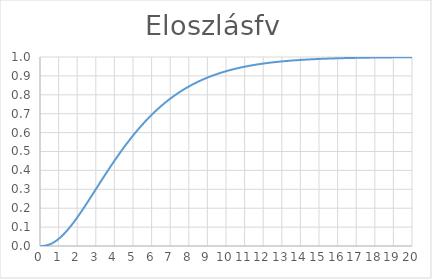
| Category | Series 0 |
|---|---|
| 0.0 | 0 |
| 0.01 | 0 |
| 0.02 | 0 |
| 0.03 | 0 |
| 0.04 | 0 |
| 0.05 | 0 |
| 0.06 | 0 |
| 0.07 | 0 |
| 0.08 | 0 |
| 0.09 | 0 |
| 0.1 | 0 |
| 0.11 | 0 |
| 0.12 | 0 |
| 0.13 | 0 |
| 0.14 | 0 |
| 0.15 | 0 |
| 0.16 | 0.001 |
| 0.17 | 0.001 |
| 0.18 | 0.001 |
| 0.19 | 0.001 |
| 0.2 | 0.001 |
| 0.21 | 0.001 |
| 0.22 | 0.001 |
| 0.23 | 0.001 |
| 0.24 | 0.001 |
| 0.25 | 0.002 |
| 0.26 | 0.002 |
| 0.27 | 0.002 |
| 0.28 | 0.002 |
| 0.29 | 0.002 |
| 0.3 | 0.002 |
| 0.31 | 0.003 |
| 0.32 | 0.003 |
| 0.33 | 0.003 |
| 0.34 | 0.003 |
| 0.35 | 0.003 |
| 0.36 | 0.004 |
| 0.37 | 0.004 |
| 0.38 | 0.004 |
| 0.39 | 0.004 |
| 0.4 | 0.005 |
| 0.41 | 0.005 |
| 0.42 | 0.005 |
| 0.43 | 0.006 |
| 0.44 | 0.006 |
| 0.45 | 0.006 |
| 0.46 | 0.006 |
| 0.47 | 0.007 |
| 0.48 | 0.007 |
| 0.49 | 0.008 |
| 0.5 | 0.008 |
| 0.51 | 0.008 |
| 0.52 | 0.009 |
| 0.53 | 0.009 |
| 0.54 | 0.009 |
| 0.55 | 0.01 |
| 0.56 | 0.01 |
| 0.57 | 0.011 |
| 0.58 | 0.011 |
| 0.59 | 0.012 |
| 0.6 | 0.012 |
| 0.61 | 0.012 |
| 0.62 | 0.013 |
| 0.63 | 0.013 |
| 0.64 | 0.014 |
| 0.65 | 0.014 |
| 0.66 | 0.015 |
| 0.67 | 0.015 |
| 0.68 | 0.016 |
| 0.69 | 0.016 |
| 0.7 | 0.017 |
| 0.71 | 0.018 |
| 0.72 | 0.018 |
| 0.73 | 0.019 |
| 0.74 | 0.019 |
| 0.75 | 0.02 |
| 0.76 | 0.02 |
| 0.77 | 0.021 |
| 0.78 | 0.022 |
| 0.79 | 0.022 |
| 0.8 | 0.023 |
| 0.81 | 0.024 |
| 0.82 | 0.024 |
| 0.83 | 0.025 |
| 0.84 | 0.026 |
| 0.85 | 0.026 |
| 0.86 | 0.027 |
| 0.87 | 0.028 |
| 0.88 | 0.028 |
| 0.89 | 0.029 |
| 0.9 | 0.03 |
| 0.91 | 0.031 |
| 0.92 | 0.031 |
| 0.93 | 0.032 |
| 0.94 | 0.033 |
| 0.95 | 0.034 |
| 0.96 | 0.034 |
| 0.97 | 0.035 |
| 0.98 | 0.036 |
| 0.99 | 0.037 |
| 1.0 | 0.037 |
| 1.01 | 0.038 |
| 1.02 | 0.039 |
| 1.03 | 0.04 |
| 1.04 | 0.041 |
| 1.05 | 0.042 |
| 1.06 | 0.042 |
| 1.07 | 0.043 |
| 1.08 | 0.044 |
| 1.09 | 0.045 |
| 1.1 | 0.046 |
| 1.11 | 0.047 |
| 1.12 | 0.048 |
| 1.13 | 0.049 |
| 1.14 | 0.049 |
| 1.15 | 0.05 |
| 1.16 | 0.051 |
| 1.17 | 0.052 |
| 1.18 | 0.053 |
| 1.19 | 0.054 |
| 1.2 | 0.055 |
| 1.21 | 0.056 |
| 1.22 | 0.057 |
| 1.23 | 0.058 |
| 1.24 | 0.059 |
| 1.25 | 0.06 |
| 1.26 | 0.061 |
| 1.27 | 0.062 |
| 1.28 | 0.063 |
| 1.29 | 0.064 |
| 1.3 | 0.065 |
| 1.31 | 0.066 |
| 1.32 | 0.067 |
| 1.33 | 0.068 |
| 1.34 | 0.069 |
| 1.35 | 0.07 |
| 1.36 | 0.071 |
| 1.37 | 0.072 |
| 1.38 | 0.074 |
| 1.39 | 0.075 |
| 1.4 | 0.076 |
| 1.41 | 0.077 |
| 1.42 | 0.078 |
| 1.43 | 0.079 |
| 1.44 | 0.08 |
| 1.45 | 0.081 |
| 1.46 | 0.082 |
| 1.47 | 0.083 |
| 1.48 | 0.085 |
| 1.49 | 0.086 |
| 1.5 | 0.087 |
| 1.51 | 0.088 |
| 1.52 | 0.089 |
| 1.53 | 0.09 |
| 1.54 | 0.092 |
| 1.55 | 0.093 |
| 1.56 | 0.094 |
| 1.57 | 0.095 |
| 1.58 | 0.096 |
| 1.59 | 0.098 |
| 1.6 | 0.099 |
| 1.61 | 0.1 |
| 1.62 | 0.101 |
| 1.63 | 0.102 |
| 1.64 | 0.104 |
| 1.65 | 0.105 |
| 1.66 | 0.106 |
| 1.67 | 0.107 |
| 1.68 | 0.109 |
| 1.69 | 0.11 |
| 1.7 | 0.111 |
| 1.71 | 0.112 |
| 1.72 | 0.114 |
| 1.73 | 0.115 |
| 1.74 | 0.116 |
| 1.75 | 0.117 |
| 1.76 | 0.119 |
| 1.77 | 0.12 |
| 1.78 | 0.121 |
| 1.79 | 0.123 |
| 1.8 | 0.124 |
| 1.81 | 0.125 |
| 1.82 | 0.127 |
| 1.83 | 0.128 |
| 1.84 | 0.129 |
| 1.85 | 0.131 |
| 1.86 | 0.132 |
| 1.87 | 0.133 |
| 1.88 | 0.135 |
| 1.89 | 0.136 |
| 1.9 | 0.137 |
| 1.91 | 0.139 |
| 1.92 | 0.14 |
| 1.93 | 0.141 |
| 1.94 | 0.143 |
| 1.95 | 0.144 |
| 1.96 | 0.145 |
| 1.97 | 0.147 |
| 1.98 | 0.148 |
| 1.99 | 0.149 |
| 2.0 | 0.151 |
| 2.01 | 0.152 |
| 2.02 | 0.154 |
| 2.03 | 0.155 |
| 2.04 | 0.156 |
| 2.05 | 0.158 |
| 2.06 | 0.159 |
| 2.07 | 0.161 |
| 2.08 | 0.162 |
| 2.09 | 0.163 |
| 2.1 | 0.165 |
| 2.11 | 0.166 |
| 2.12 | 0.168 |
| 2.13 | 0.169 |
| 2.14 | 0.171 |
| 2.15 | 0.172 |
| 2.16 | 0.173 |
| 2.17 | 0.175 |
| 2.18 | 0.176 |
| 2.19 | 0.178 |
| 2.2 | 0.179 |
| 2.21 | 0.181 |
| 2.22 | 0.182 |
| 2.23 | 0.184 |
| 2.24 | 0.185 |
| 2.25 | 0.186 |
| 2.26 | 0.188 |
| 2.27 | 0.189 |
| 2.28 | 0.191 |
| 2.29 | 0.192 |
| 2.3 | 0.194 |
| 2.31 | 0.195 |
| 2.32 | 0.197 |
| 2.33 | 0.198 |
| 2.34 | 0.2 |
| 2.35 | 0.201 |
| 2.36 | 0.203 |
| 2.37 | 0.204 |
| 2.38 | 0.206 |
| 2.39 | 0.207 |
| 2.4 | 0.209 |
| 2.41 | 0.21 |
| 2.42 | 0.212 |
| 2.43 | 0.213 |
| 2.44 | 0.214 |
| 2.45 | 0.216 |
| 2.46 | 0.217 |
| 2.47 | 0.219 |
| 2.48 | 0.22 |
| 2.49 | 0.222 |
| 2.5 | 0.224 |
| 2.51 | 0.225 |
| 2.52 | 0.227 |
| 2.53 | 0.228 |
| 2.54 | 0.23 |
| 2.55 | 0.231 |
| 2.56 | 0.233 |
| 2.57 | 0.234 |
| 2.58 | 0.236 |
| 2.59 | 0.237 |
| 2.6 | 0.239 |
| 2.61 | 0.24 |
| 2.62 | 0.242 |
| 2.63 | 0.243 |
| 2.64 | 0.245 |
| 2.65 | 0.246 |
| 2.66 | 0.248 |
| 2.67 | 0.249 |
| 2.68 | 0.251 |
| 2.69 | 0.252 |
| 2.7 | 0.254 |
| 2.71 | 0.255 |
| 2.72 | 0.257 |
| 2.73 | 0.258 |
| 2.74 | 0.26 |
| 2.75 | 0.262 |
| 2.76 | 0.263 |
| 2.77 | 0.265 |
| 2.78 | 0.266 |
| 2.79 | 0.268 |
| 2.8 | 0.269 |
| 2.81 | 0.271 |
| 2.82 | 0.272 |
| 2.83 | 0.274 |
| 2.84 | 0.275 |
| 2.85 | 0.277 |
| 2.86 | 0.278 |
| 2.87 | 0.28 |
| 2.88 | 0.282 |
| 2.89 | 0.283 |
| 2.9 | 0.285 |
| 2.91 | 0.286 |
| 2.92 | 0.288 |
| 2.93 | 0.289 |
| 2.94 | 0.291 |
| 2.95 | 0.292 |
| 2.96 | 0.294 |
| 2.97 | 0.295 |
| 2.98 | 0.297 |
| 2.99 | 0.298 |
| 3.0 | 0.3 |
| 3.01 | 0.302 |
| 3.02 | 0.303 |
| 3.03 | 0.305 |
| 3.04 | 0.306 |
| 3.05 | 0.308 |
| 3.06 | 0.309 |
| 3.07 | 0.311 |
| 3.08 | 0.312 |
| 3.09 | 0.314 |
| 3.1 | 0.315 |
| 3.11 | 0.317 |
| 3.12 | 0.319 |
| 3.13 | 0.32 |
| 3.14 | 0.322 |
| 3.15 | 0.323 |
| 3.16 | 0.325 |
| 3.17 | 0.326 |
| 3.18 | 0.328 |
| 3.19 | 0.329 |
| 3.2 | 0.331 |
| 3.21 | 0.332 |
| 3.22 | 0.334 |
| 3.23 | 0.335 |
| 3.24 | 0.337 |
| 3.25 | 0.338 |
| 3.26 | 0.34 |
| 3.27 | 0.342 |
| 3.28 | 0.343 |
| 3.29 | 0.345 |
| 3.3 | 0.346 |
| 3.31 | 0.348 |
| 3.32 | 0.349 |
| 3.33 | 0.351 |
| 3.34 | 0.352 |
| 3.35 | 0.354 |
| 3.36 | 0.355 |
| 3.37 | 0.357 |
| 3.38 | 0.358 |
| 3.39 | 0.36 |
| 3.4 | 0.361 |
| 3.41 | 0.363 |
| 3.42 | 0.364 |
| 3.43 | 0.366 |
| 3.44 | 0.368 |
| 3.45 | 0.369 |
| 3.46 | 0.371 |
| 3.47 | 0.372 |
| 3.48 | 0.374 |
| 3.49 | 0.375 |
| 3.5 | 0.377 |
| 3.51 | 0.378 |
| 3.52 | 0.38 |
| 3.53 | 0.381 |
| 3.54 | 0.383 |
| 3.55 | 0.384 |
| 3.56 | 0.386 |
| 3.57 | 0.387 |
| 3.58 | 0.389 |
| 3.59 | 0.39 |
| 3.6 | 0.392 |
| 3.61 | 0.393 |
| 3.62 | 0.395 |
| 3.63 | 0.396 |
| 3.64 | 0.398 |
| 3.65 | 0.399 |
| 3.66 | 0.401 |
| 3.67 | 0.402 |
| 3.68 | 0.404 |
| 3.69 | 0.405 |
| 3.7 | 0.407 |
| 3.71 | 0.408 |
| 3.72 | 0.41 |
| 3.73 | 0.411 |
| 3.74 | 0.413 |
| 3.75 | 0.414 |
| 3.76 | 0.416 |
| 3.77 | 0.417 |
| 3.78 | 0.418 |
| 3.79 | 0.42 |
| 3.8 | 0.421 |
| 3.81 | 0.423 |
| 3.82 | 0.424 |
| 3.83 | 0.426 |
| 3.84 | 0.427 |
| 3.85 | 0.429 |
| 3.86 | 0.43 |
| 3.87 | 0.432 |
| 3.88 | 0.433 |
| 3.89 | 0.435 |
| 3.9 | 0.436 |
| 3.91 | 0.438 |
| 3.92 | 0.439 |
| 3.93 | 0.44 |
| 3.94 | 0.442 |
| 3.95 | 0.443 |
| 3.96 | 0.445 |
| 3.97 | 0.446 |
| 3.98 | 0.448 |
| 3.99 | 0.449 |
| 4.0 | 0.451 |
| 4.01 | 0.452 |
| 4.02 | 0.453 |
| 4.03 | 0.455 |
| 4.04 | 0.456 |
| 4.05 | 0.458 |
| 4.06 | 0.459 |
| 4.07 | 0.461 |
| 4.08 | 0.462 |
| 4.09 | 0.463 |
| 4.1 | 0.465 |
| 4.11 | 0.466 |
| 4.12 | 0.468 |
| 4.13 | 0.469 |
| 4.14 | 0.471 |
| 4.15 | 0.472 |
| 4.16 | 0.473 |
| 4.17 | 0.475 |
| 4.18 | 0.476 |
| 4.19 | 0.478 |
| 4.2 | 0.479 |
| 4.21 | 0.48 |
| 4.22 | 0.482 |
| 4.23 | 0.483 |
| 4.24 | 0.485 |
| 4.25 | 0.486 |
| 4.26 | 0.487 |
| 4.27 | 0.489 |
| 4.28 | 0.49 |
| 4.29 | 0.492 |
| 4.3 | 0.493 |
| 4.31 | 0.494 |
| 4.32 | 0.496 |
| 4.33 | 0.497 |
| 4.34 | 0.498 |
| 4.35 | 0.5 |
| 4.36 | 0.501 |
| 4.37 | 0.503 |
| 4.38 | 0.504 |
| 4.39 | 0.505 |
| 4.4 | 0.507 |
| 4.41 | 0.508 |
| 4.42 | 0.509 |
| 4.43 | 0.511 |
| 4.44 | 0.512 |
| 4.45 | 0.513 |
| 4.46 | 0.515 |
| 4.47 | 0.516 |
| 4.48 | 0.517 |
| 4.49 | 0.519 |
| 4.5 | 0.52 |
| 4.51 | 0.521 |
| 4.52 | 0.523 |
| 4.53 | 0.524 |
| 4.54 | 0.525 |
| 4.55 | 0.527 |
| 4.56 | 0.528 |
| 4.57 | 0.529 |
| 4.58 | 0.531 |
| 4.59 | 0.532 |
| 4.6 | 0.533 |
| 4.61 | 0.535 |
| 4.62 | 0.536 |
| 4.63 | 0.537 |
| 4.64 | 0.539 |
| 4.65 | 0.54 |
| 4.66 | 0.541 |
| 4.67 | 0.543 |
| 4.68 | 0.544 |
| 4.69 | 0.545 |
| 4.7 | 0.546 |
| 4.71 | 0.548 |
| 4.72 | 0.549 |
| 4.73 | 0.55 |
| 4.74 | 0.552 |
| 4.75 | 0.553 |
| 4.76 | 0.554 |
| 4.77 | 0.555 |
| 4.78 | 0.557 |
| 4.79 | 0.558 |
| 4.8 | 0.559 |
| 4.81 | 0.56 |
| 4.82 | 0.562 |
| 4.83 | 0.563 |
| 4.84 | 0.564 |
| 4.85 | 0.566 |
| 4.86 | 0.567 |
| 4.87 | 0.568 |
| 4.88 | 0.569 |
| 4.89 | 0.571 |
| 4.9 | 0.572 |
| 4.91 | 0.573 |
| 4.92 | 0.574 |
| 4.93 | 0.576 |
| 4.94 | 0.577 |
| 4.95 | 0.578 |
| 4.96 | 0.579 |
| 4.97 | 0.58 |
| 4.98 | 0.582 |
| 4.99 | 0.583 |
| 5.0 | 0.584 |
| 5.01 | 0.585 |
| 5.02 | 0.587 |
| 5.03 | 0.588 |
| 5.04 | 0.589 |
| 5.05 | 0.59 |
| 5.06 | 0.591 |
| 5.07 | 0.593 |
| 5.08 | 0.594 |
| 5.09 | 0.595 |
| 5.1 | 0.596 |
| 5.11 | 0.597 |
| 5.12 | 0.599 |
| 5.13 | 0.6 |
| 5.14 | 0.601 |
| 5.15 | 0.602 |
| 5.16 | 0.603 |
| 5.17 | 0.605 |
| 5.18 | 0.606 |
| 5.19 | 0.607 |
| 5.2 | 0.608 |
| 5.21 | 0.609 |
| 5.22 | 0.61 |
| 5.23 | 0.612 |
| 5.24 | 0.613 |
| 5.25 | 0.614 |
| 5.26 | 0.615 |
| 5.27 | 0.616 |
| 5.28 | 0.617 |
| 5.29 | 0.618 |
| 5.3 | 0.62 |
| 5.31 | 0.621 |
| 5.32 | 0.622 |
| 5.33 | 0.623 |
| 5.34 | 0.624 |
| 5.35 | 0.625 |
| 5.36 | 0.626 |
| 5.37 | 0.628 |
| 5.38 | 0.629 |
| 5.39 | 0.63 |
| 5.4 | 0.631 |
| 5.41 | 0.632 |
| 5.42 | 0.633 |
| 5.43 | 0.634 |
| 5.44 | 0.635 |
| 5.45 | 0.637 |
| 5.46 | 0.638 |
| 5.47 | 0.639 |
| 5.48 | 0.64 |
| 5.49 | 0.641 |
| 5.5 | 0.642 |
| 5.51 | 0.643 |
| 5.52 | 0.644 |
| 5.53 | 0.645 |
| 5.54 | 0.646 |
| 5.55 | 0.648 |
| 5.56 | 0.649 |
| 5.57 | 0.65 |
| 5.58 | 0.651 |
| 5.59 | 0.652 |
| 5.6 | 0.653 |
| 5.61 | 0.654 |
| 5.62 | 0.655 |
| 5.63 | 0.656 |
| 5.64 | 0.657 |
| 5.65 | 0.658 |
| 5.66 | 0.659 |
| 5.67 | 0.66 |
| 5.68 | 0.661 |
| 5.69 | 0.662 |
| 5.7 | 0.663 |
| 5.71 | 0.665 |
| 5.72 | 0.666 |
| 5.73 | 0.667 |
| 5.74 | 0.668 |
| 5.75 | 0.669 |
| 5.76 | 0.67 |
| 5.77 | 0.671 |
| 5.78 | 0.672 |
| 5.79 | 0.673 |
| 5.8 | 0.674 |
| 5.81 | 0.675 |
| 5.82 | 0.676 |
| 5.83 | 0.677 |
| 5.84 | 0.678 |
| 5.85 | 0.679 |
| 5.86 | 0.68 |
| 5.87 | 0.681 |
| 5.88 | 0.682 |
| 5.89 | 0.683 |
| 5.9 | 0.684 |
| 5.91 | 0.685 |
| 5.92 | 0.686 |
| 5.93 | 0.687 |
| 5.94 | 0.688 |
| 5.95 | 0.689 |
| 5.96 | 0.69 |
| 5.97 | 0.691 |
| 5.98 | 0.692 |
| 5.99 | 0.693 |
| 6.0 | 0.694 |
| 6.01 | 0.695 |
| 6.02 | 0.696 |
| 6.03 | 0.697 |
| 6.04 | 0.698 |
| 6.05 | 0.699 |
| 6.06 | 0.7 |
| 6.07 | 0.701 |
| 6.08 | 0.701 |
| 6.09 | 0.702 |
| 6.1 | 0.703 |
| 6.11 | 0.704 |
| 6.12 | 0.705 |
| 6.13 | 0.706 |
| 6.14 | 0.707 |
| 6.15 | 0.708 |
| 6.16 | 0.709 |
| 6.17 | 0.71 |
| 6.18 | 0.711 |
| 6.19 | 0.712 |
| 6.2 | 0.713 |
| 6.21 | 0.714 |
| 6.22 | 0.715 |
| 6.23 | 0.716 |
| 6.24 | 0.716 |
| 6.25 | 0.717 |
| 6.26 | 0.718 |
| 6.27 | 0.719 |
| 6.28 | 0.72 |
| 6.29 | 0.721 |
| 6.3 | 0.722 |
| 6.31 | 0.723 |
| 6.32 | 0.724 |
| 6.33 | 0.725 |
| 6.34 | 0.725 |
| 6.35 | 0.726 |
| 6.36 | 0.727 |
| 6.37 | 0.728 |
| 6.38 | 0.729 |
| 6.39 | 0.73 |
| 6.4 | 0.731 |
| 6.41 | 0.732 |
| 6.42 | 0.733 |
| 6.43 | 0.733 |
| 6.44 | 0.734 |
| 6.45 | 0.735 |
| 6.46 | 0.736 |
| 6.47 | 0.737 |
| 6.48 | 0.738 |
| 6.49 | 0.739 |
| 6.5 | 0.739 |
| 6.51 | 0.74 |
| 6.52 | 0.741 |
| 6.53 | 0.742 |
| 6.54 | 0.743 |
| 6.55 | 0.744 |
| 6.56 | 0.745 |
| 6.57 | 0.745 |
| 6.58 | 0.746 |
| 6.59 | 0.747 |
| 6.6 | 0.748 |
| 6.61 | 0.749 |
| 6.62 | 0.75 |
| 6.63 | 0.75 |
| 6.64 | 0.751 |
| 6.65 | 0.752 |
| 6.66 | 0.753 |
| 6.67 | 0.754 |
| 6.68 | 0.754 |
| 6.69 | 0.755 |
| 6.7 | 0.756 |
| 6.71 | 0.757 |
| 6.72 | 0.758 |
| 6.73 | 0.758 |
| 6.74 | 0.759 |
| 6.75 | 0.76 |
| 6.76 | 0.761 |
| 6.77 | 0.762 |
| 6.78 | 0.762 |
| 6.79 | 0.763 |
| 6.8 | 0.764 |
| 6.81 | 0.765 |
| 6.82 | 0.766 |
| 6.83 | 0.766 |
| 6.84 | 0.767 |
| 6.85 | 0.768 |
| 6.86 | 0.769 |
| 6.87 | 0.77 |
| 6.88 | 0.77 |
| 6.89 | 0.771 |
| 6.9 | 0.772 |
| 6.91 | 0.773 |
| 6.92 | 0.773 |
| 6.93 | 0.774 |
| 6.94 | 0.775 |
| 6.95 | 0.776 |
| 6.96 | 0.776 |
| 6.97 | 0.777 |
| 6.98 | 0.778 |
| 6.99 | 0.779 |
| 7.0 | 0.779 |
| 7.01 | 0.78 |
| 7.02 | 0.781 |
| 7.03 | 0.782 |
| 7.04 | 0.782 |
| 7.05 | 0.783 |
| 7.06 | 0.784 |
| 7.07 | 0.785 |
| 7.08 | 0.785 |
| 7.09 | 0.786 |
| 7.1 | 0.787 |
| 7.11 | 0.787 |
| 7.12 | 0.788 |
| 7.13 | 0.789 |
| 7.14 | 0.79 |
| 7.15 | 0.79 |
| 7.16 | 0.791 |
| 7.17 | 0.792 |
| 7.18 | 0.792 |
| 7.19 | 0.793 |
| 7.2 | 0.794 |
| 7.21 | 0.795 |
| 7.22 | 0.795 |
| 7.23 | 0.796 |
| 7.24 | 0.797 |
| 7.25 | 0.797 |
| 7.26 | 0.798 |
| 7.27 | 0.799 |
| 7.28 | 0.799 |
| 7.29 | 0.8 |
| 7.3 | 0.801 |
| 7.31 | 0.801 |
| 7.32 | 0.802 |
| 7.33 | 0.803 |
| 7.34 | 0.803 |
| 7.35 | 0.804 |
| 7.36 | 0.805 |
| 7.37 | 0.805 |
| 7.38 | 0.806 |
| 7.39 | 0.807 |
| 7.4 | 0.807 |
| 7.41 | 0.808 |
| 7.42 | 0.809 |
| 7.43 | 0.809 |
| 7.44 | 0.81 |
| 7.45 | 0.811 |
| 7.46 | 0.811 |
| 7.47 | 0.812 |
| 7.48 | 0.813 |
| 7.49 | 0.813 |
| 7.5 | 0.814 |
| 7.51 | 0.815 |
| 7.52 | 0.815 |
| 7.53 | 0.816 |
| 7.54 | 0.817 |
| 7.55 | 0.817 |
| 7.56 | 0.818 |
| 7.57 | 0.818 |
| 7.58 | 0.819 |
| 7.59 | 0.82 |
| 7.6 | 0.82 |
| 7.61 | 0.821 |
| 7.62 | 0.822 |
| 7.63 | 0.822 |
| 7.64 | 0.823 |
| 7.65 | 0.823 |
| 7.66 | 0.824 |
| 7.67 | 0.825 |
| 7.68 | 0.825 |
| 7.69 | 0.826 |
| 7.7 | 0.826 |
| 7.71 | 0.827 |
| 7.72 | 0.828 |
| 7.73 | 0.828 |
| 7.74 | 0.829 |
| 7.75 | 0.829 |
| 7.76 | 0.83 |
| 7.77 | 0.831 |
| 7.78 | 0.831 |
| 7.79 | 0.832 |
| 7.8 | 0.832 |
| 7.81 | 0.833 |
| 7.82 | 0.834 |
| 7.83 | 0.834 |
| 7.84 | 0.835 |
| 7.85 | 0.835 |
| 7.86 | 0.836 |
| 7.87 | 0.836 |
| 7.88 | 0.837 |
| 7.89 | 0.838 |
| 7.9 | 0.838 |
| 7.91 | 0.839 |
| 7.92 | 0.839 |
| 7.93 | 0.84 |
| 7.94 | 0.84 |
| 7.95 | 0.841 |
| 7.96 | 0.842 |
| 7.97 | 0.842 |
| 7.98 | 0.843 |
| 7.99 | 0.843 |
| 8.0 | 0.844 |
| 8.01 | 0.844 |
| 8.02 | 0.845 |
| 8.03 | 0.845 |
| 8.04 | 0.846 |
| 8.05 | 0.846 |
| 8.06 | 0.847 |
| 8.07 | 0.848 |
| 8.08 | 0.848 |
| 8.09 | 0.849 |
| 8.1 | 0.849 |
| 8.11 | 0.85 |
| 8.12 | 0.85 |
| 8.13 | 0.851 |
| 8.14 | 0.851 |
| 8.15 | 0.852 |
| 8.16 | 0.852 |
| 8.17 | 0.853 |
| 8.18 | 0.853 |
| 8.19 | 0.854 |
| 8.2 | 0.854 |
| 8.21 | 0.855 |
| 8.22 | 0.855 |
| 8.23 | 0.856 |
| 8.24 | 0.857 |
| 8.25 | 0.857 |
| 8.26 | 0.858 |
| 8.27 | 0.858 |
| 8.28 | 0.859 |
| 8.29 | 0.859 |
| 8.3 | 0.86 |
| 8.31 | 0.86 |
| 8.32 | 0.861 |
| 8.33 | 0.861 |
| 8.34 | 0.862 |
| 8.35 | 0.862 |
| 8.36 | 0.863 |
| 8.37 | 0.863 |
| 8.38 | 0.864 |
| 8.39 | 0.864 |
| 8.4 | 0.864 |
| 8.41 | 0.865 |
| 8.42 | 0.865 |
| 8.43 | 0.866 |
| 8.44 | 0.866 |
| 8.45 | 0.867 |
| 8.46 | 0.867 |
| 8.47 | 0.868 |
| 8.48 | 0.868 |
| 8.49 | 0.869 |
| 8.5 | 0.869 |
| 8.51 | 0.87 |
| 8.52 | 0.87 |
| 8.53 | 0.871 |
| 8.54 | 0.871 |
| 8.55 | 0.872 |
| 8.56 | 0.872 |
| 8.57 | 0.873 |
| 8.58 | 0.873 |
| 8.59 | 0.873 |
| 8.6 | 0.874 |
| 8.61 | 0.874 |
| 8.62 | 0.875 |
| 8.63 | 0.875 |
| 8.64 | 0.876 |
| 8.65 | 0.876 |
| 8.66 | 0.877 |
| 8.67 | 0.877 |
| 8.68 | 0.877 |
| 8.69 | 0.878 |
| 8.7 | 0.878 |
| 8.71 | 0.879 |
| 8.72 | 0.879 |
| 8.73 | 0.88 |
| 8.74 | 0.88 |
| 8.75 | 0.881 |
| 8.76 | 0.881 |
| 8.77 | 0.881 |
| 8.78 | 0.882 |
| 8.79 | 0.882 |
| 8.8 | 0.883 |
| 8.81 | 0.883 |
| 8.82 | 0.884 |
| 8.83 | 0.884 |
| 8.84 | 0.884 |
| 8.85 | 0.885 |
| 8.86 | 0.885 |
| 8.87 | 0.886 |
| 8.88 | 0.886 |
| 8.89 | 0.886 |
| 8.9 | 0.887 |
| 8.91 | 0.887 |
| 8.92 | 0.888 |
| 8.93 | 0.888 |
| 8.94 | 0.889 |
| 8.95 | 0.889 |
| 8.96 | 0.889 |
| 8.97 | 0.89 |
| 8.98 | 0.89 |
| 8.99 | 0.891 |
| 9.0 | 0.891 |
| 9.01 | 0.891 |
| 9.02 | 0.892 |
| 9.03 | 0.892 |
| 9.04 | 0.893 |
| 9.05 | 0.893 |
| 9.06 | 0.893 |
| 9.07 | 0.894 |
| 9.08 | 0.894 |
| 9.09 | 0.894 |
| 9.1 | 0.895 |
| 9.11 | 0.895 |
| 9.12 | 0.896 |
| 9.13 | 0.896 |
| 9.14 | 0.896 |
| 9.15 | 0.897 |
| 9.16 | 0.897 |
| 9.17 | 0.898 |
| 9.18 | 0.898 |
| 9.19 | 0.898 |
| 9.2 | 0.899 |
| 9.21 | 0.899 |
| 9.22 | 0.899 |
| 9.23 | 0.9 |
| 9.24 | 0.9 |
| 9.25 | 0.901 |
| 9.26 | 0.901 |
| 9.27 | 0.901 |
| 9.28 | 0.902 |
| 9.29 | 0.902 |
| 9.3 | 0.902 |
| 9.31 | 0.903 |
| 9.32 | 0.903 |
| 9.33 | 0.903 |
| 9.34 | 0.904 |
| 9.35 | 0.904 |
| 9.36 | 0.904 |
| 9.37 | 0.905 |
| 9.38 | 0.905 |
| 9.39 | 0.906 |
| 9.4 | 0.906 |
| 9.41 | 0.906 |
| 9.42 | 0.907 |
| 9.43 | 0.907 |
| 9.44 | 0.907 |
| 9.45 | 0.908 |
| 9.46 | 0.908 |
| 9.47 | 0.908 |
| 9.48 | 0.909 |
| 9.49 | 0.909 |
| 9.5 | 0.909 |
| 9.51 | 0.91 |
| 9.52 | 0.91 |
| 9.53 | 0.91 |
| 9.54 | 0.911 |
| 9.55 | 0.911 |
| 9.56 | 0.911 |
| 9.57 | 0.912 |
| 9.58 | 0.912 |
| 9.59 | 0.912 |
| 9.6 | 0.913 |
| 9.61 | 0.913 |
| 9.62 | 0.913 |
| 9.63 | 0.914 |
| 9.64 | 0.914 |
| 9.65 | 0.914 |
| 9.66 | 0.915 |
| 9.67 | 0.915 |
| 9.68 | 0.915 |
| 9.69 | 0.915 |
| 9.7 | 0.916 |
| 9.71 | 0.916 |
| 9.72 | 0.916 |
| 9.73 | 0.917 |
| 9.74 | 0.917 |
| 9.75 | 0.917 |
| 9.76 | 0.918 |
| 9.77 | 0.918 |
| 9.78 | 0.918 |
| 9.79 | 0.919 |
| 9.8 | 0.919 |
| 9.81 | 0.919 |
| 9.82 | 0.92 |
| 9.83 | 0.92 |
| 9.84 | 0.92 |
| 9.85 | 0.92 |
| 9.86 | 0.921 |
| 9.87 | 0.921 |
| 9.88 | 0.921 |
| 9.89 | 0.922 |
| 9.9 | 0.922 |
| 9.91 | 0.922 |
| 9.92 | 0.922 |
| 9.93 | 0.923 |
| 9.94 | 0.923 |
| 9.95 | 0.923 |
| 9.96 | 0.924 |
| 9.97 | 0.924 |
| 9.98 | 0.924 |
| 9.99 | 0.924 |
| 10.0 | 0.925 |
| 10.01 | 0.925 |
| 10.02 | 0.925 |
| 10.03 | 0.926 |
| 10.04 | 0.926 |
| 10.05 | 0.926 |
| 10.06 | 0.926 |
| 10.07 | 0.927 |
| 10.08 | 0.927 |
| 10.09 | 0.927 |
| 10.1 | 0.928 |
| 10.11 | 0.928 |
| 10.12 | 0.928 |
| 10.13 | 0.928 |
| 10.14 | 0.929 |
| 10.15 | 0.929 |
| 10.16 | 0.929 |
| 10.17 | 0.929 |
| 10.18 | 0.93 |
| 10.19 | 0.93 |
| 10.2 | 0.93 |
| 10.21 | 0.931 |
| 10.22 | 0.931 |
| 10.23 | 0.931 |
| 10.24 | 0.931 |
| 10.25 | 0.932 |
| 10.26 | 0.932 |
| 10.27 | 0.932 |
| 10.28 | 0.932 |
| 10.29 | 0.933 |
| 10.3 | 0.933 |
| 10.31 | 0.933 |
| 10.32 | 0.933 |
| 10.33 | 0.934 |
| 10.34 | 0.934 |
| 10.35 | 0.934 |
| 10.36 | 0.934 |
| 10.37 | 0.935 |
| 10.38 | 0.935 |
| 10.39 | 0.935 |
| 10.4 | 0.935 |
| 10.41 | 0.936 |
| 10.42 | 0.936 |
| 10.43 | 0.936 |
| 10.44 | 0.936 |
| 10.45 | 0.937 |
| 10.46 | 0.937 |
| 10.47 | 0.937 |
| 10.48 | 0.937 |
| 10.49 | 0.938 |
| 10.5 | 0.938 |
| 10.51 | 0.938 |
| 10.52 | 0.938 |
| 10.53 | 0.938 |
| 10.54 | 0.939 |
| 10.55 | 0.939 |
| 10.56 | 0.939 |
| 10.57 | 0.939 |
| 10.58 | 0.94 |
| 10.59 | 0.94 |
| 10.6 | 0.94 |
| 10.61 | 0.94 |
| 10.62 | 0.941 |
| 10.63 | 0.941 |
| 10.64 | 0.941 |
| 10.65 | 0.941 |
| 10.66 | 0.941 |
| 10.67 | 0.942 |
| 10.68 | 0.942 |
| 10.69 | 0.942 |
| 10.7 | 0.942 |
| 10.71 | 0.943 |
| 10.72 | 0.943 |
| 10.73 | 0.943 |
| 10.74 | 0.943 |
| 10.75 | 0.943 |
| 10.76 | 0.944 |
| 10.77 | 0.944 |
| 10.78 | 0.944 |
| 10.79 | 0.944 |
| 10.8 | 0.945 |
| 10.81 | 0.945 |
| 10.82 | 0.945 |
| 10.83 | 0.945 |
| 10.84 | 0.945 |
| 10.85 | 0.946 |
| 10.86 | 0.946 |
| 10.87 | 0.946 |
| 10.88 | 0.946 |
| 10.89 | 0.946 |
| 10.9 | 0.947 |
| 10.91 | 0.947 |
| 10.92 | 0.947 |
| 10.93 | 0.947 |
| 10.94 | 0.947 |
| 10.95 | 0.948 |
| 10.96 | 0.948 |
| 10.97 | 0.948 |
| 10.98 | 0.948 |
| 10.99 | 0.948 |
| 11.0 | 0.949 |
| 11.01 | 0.949 |
| 11.02 | 0.949 |
| 11.03 | 0.949 |
| 11.04 | 0.949 |
| 11.05 | 0.95 |
| 11.06 | 0.95 |
| 11.07 | 0.95 |
| 11.08 | 0.95 |
| 11.09 | 0.95 |
| 11.1 | 0.951 |
| 11.11 | 0.951 |
| 11.12 | 0.951 |
| 11.13 | 0.951 |
| 11.14 | 0.951 |
| 11.15 | 0.952 |
| 11.16 | 0.952 |
| 11.17 | 0.952 |
| 11.18 | 0.952 |
| 11.19 | 0.952 |
| 11.2 | 0.952 |
| 11.21 | 0.953 |
| 11.22 | 0.953 |
| 11.23 | 0.953 |
| 11.24 | 0.953 |
| 11.25 | 0.953 |
| 11.26 | 0.954 |
| 11.27 | 0.954 |
| 11.28 | 0.954 |
| 11.29 | 0.954 |
| 11.3 | 0.954 |
| 11.31 | 0.954 |
| 11.32 | 0.955 |
| 11.33 | 0.955 |
| 11.34 | 0.955 |
| 11.35 | 0.955 |
| 11.36 | 0.955 |
| 11.37 | 0.955 |
| 11.38 | 0.956 |
| 11.39 | 0.956 |
| 11.4 | 0.956 |
| 11.41 | 0.956 |
| 11.42 | 0.956 |
| 11.43 | 0.957 |
| 11.44 | 0.957 |
| 11.45 | 0.957 |
| 11.46 | 0.957 |
| 11.47 | 0.957 |
| 11.48 | 0.957 |
| 11.49 | 0.958 |
| 11.5 | 0.958 |
| 11.51 | 0.958 |
| 11.52 | 0.958 |
| 11.53 | 0.958 |
| 11.54 | 0.958 |
| 11.55 | 0.958 |
| 11.56 | 0.959 |
| 11.57 | 0.959 |
| 11.58 | 0.959 |
| 11.59 | 0.959 |
| 11.6 | 0.959 |
| 11.61 | 0.959 |
| 11.62 | 0.96 |
| 11.63 | 0.96 |
| 11.64 | 0.96 |
| 11.65 | 0.96 |
| 11.66 | 0.96 |
| 11.67 | 0.96 |
| 11.68 | 0.961 |
| 11.69 | 0.961 |
| 11.7 | 0.961 |
| 11.71 | 0.961 |
| 11.72 | 0.961 |
| 11.73 | 0.961 |
| 11.74 | 0.961 |
| 11.75 | 0.962 |
| 11.76 | 0.962 |
| 11.77 | 0.962 |
| 11.78 | 0.962 |
| 11.79 | 0.962 |
| 11.8 | 0.962 |
| 11.81 | 0.963 |
| 11.82 | 0.963 |
| 11.83 | 0.963 |
| 11.84 | 0.963 |
| 11.85 | 0.963 |
| 11.86 | 0.963 |
| 11.87 | 0.963 |
| 11.88 | 0.964 |
| 11.89 | 0.964 |
| 11.9 | 0.964 |
| 11.91 | 0.964 |
| 11.92 | 0.964 |
| 11.93 | 0.964 |
| 11.94 | 0.964 |
| 11.95 | 0.965 |
| 11.96 | 0.965 |
| 11.97 | 0.965 |
| 11.98 | 0.965 |
| 11.99 | 0.965 |
| 12.0 | 0.965 |
| 12.01 | 0.965 |
| 12.02 | 0.965 |
| 12.03 | 0.966 |
| 12.04 | 0.966 |
| 12.05 | 0.966 |
| 12.06 | 0.966 |
| 12.07 | 0.966 |
| 12.08 | 0.966 |
| 12.09 | 0.966 |
| 12.0999999999999 | 0.967 |
| 12.1099999999999 | 0.967 |
| 12.12 | 0.967 |
| 12.13 | 0.967 |
| 12.14 | 0.967 |
| 12.15 | 0.967 |
| 12.16 | 0.967 |
| 12.17 | 0.967 |
| 12.1799999999999 | 0.968 |
| 12.1899999999999 | 0.968 |
| 12.1999999999999 | 0.968 |
| 12.21 | 0.968 |
| 12.22 | 0.968 |
| 12.23 | 0.968 |
| 12.24 | 0.968 |
| 12.25 | 0.968 |
| 12.26 | 0.969 |
| 12.2699999999999 | 0.969 |
| 12.28 | 0.969 |
| 12.2899999999999 | 0.969 |
| 12.3 | 0.969 |
| 12.31 | 0.969 |
| 12.32 | 0.969 |
| 12.33 | 0.969 |
| 12.34 | 0.97 |
| 12.3499999999999 | 0.97 |
| 12.3599999999999 | 0.97 |
| 12.37 | 0.97 |
| 12.38 | 0.97 |
| 12.39 | 0.97 |
| 12.4 | 0.97 |
| 12.41 | 0.97 |
| 12.42 | 0.971 |
| 12.4299999999999 | 0.971 |
| 12.4399999999999 | 0.971 |
| 12.4499999999999 | 0.971 |
| 12.46 | 0.971 |
| 12.47 | 0.971 |
| 12.48 | 0.971 |
| 12.49 | 0.971 |
| 12.5 | 0.971 |
| 12.51 | 0.972 |
| 12.5199999999999 | 0.972 |
| 12.53 | 0.972 |
| 12.5399999999999 | 0.972 |
| 12.55 | 0.972 |
| 12.56 | 0.972 |
| 12.5699999999999 | 0.972 |
| 12.5799999999999 | 0.972 |
| 12.5899999999999 | 0.972 |
| 12.5999999999999 | 0.973 |
| 12.6099999999999 | 0.973 |
| 12.6199999999999 | 0.973 |
| 12.6299999999999 | 0.973 |
| 12.6399999999999 | 0.973 |
| 12.6499999999999 | 0.973 |
| 12.6599999999999 | 0.973 |
| 12.6699999999999 | 0.973 |
| 12.6799999999999 | 0.973 |
| 12.6899999999999 | 0.974 |
| 12.6999999999999 | 0.974 |
| 12.7099999999999 | 0.974 |
| 12.7199999999999 | 0.974 |
| 12.7299999999999 | 0.974 |
| 12.7399999999999 | 0.974 |
| 12.7499999999999 | 0.974 |
| 12.7599999999999 | 0.974 |
| 12.7699999999999 | 0.974 |
| 12.7799999999999 | 0.974 |
| 12.7899999999999 | 0.975 |
| 12.7999999999999 | 0.975 |
| 12.8099999999999 | 0.975 |
| 12.8199999999999 | 0.975 |
| 12.8299999999999 | 0.975 |
| 12.8399999999999 | 0.975 |
| 12.8499999999999 | 0.975 |
| 12.8599999999999 | 0.975 |
| 12.8699999999999 | 0.975 |
| 12.8799999999999 | 0.975 |
| 12.8899999999999 | 0.976 |
| 12.8999999999999 | 0.976 |
| 12.9099999999999 | 0.976 |
| 12.9199999999999 | 0.976 |
| 12.9299999999999 | 0.976 |
| 12.9399999999999 | 0.976 |
| 12.9499999999999 | 0.976 |
| 12.9599999999999 | 0.976 |
| 12.9699999999999 | 0.976 |
| 12.9799999999999 | 0.976 |
| 12.9899999999999 | 0.977 |
| 12.9999999999999 | 0.977 |
| 13.0099999999999 | 0.977 |
| 13.0199999999999 | 0.977 |
| 13.0299999999999 | 0.977 |
| 13.0399999999999 | 0.977 |
| 13.0499999999999 | 0.977 |
| 13.0599999999999 | 0.977 |
| 13.0699999999999 | 0.977 |
| 13.0799999999999 | 0.977 |
| 13.0899999999999 | 0.977 |
| 13.0999999999999 | 0.978 |
| 13.1099999999999 | 0.978 |
| 13.1199999999999 | 0.978 |
| 13.1299999999999 | 0.978 |
| 13.1399999999999 | 0.978 |
| 13.1499999999999 | 0.978 |
| 13.1599999999999 | 0.978 |
| 13.1699999999999 | 0.978 |
| 13.1799999999999 | 0.978 |
| 13.1899999999999 | 0.978 |
| 13.1999999999999 | 0.978 |
| 13.2099999999999 | 0.979 |
| 13.2199999999999 | 0.979 |
| 13.2299999999999 | 0.979 |
| 13.2399999999999 | 0.979 |
| 13.2499999999999 | 0.979 |
| 13.2599999999999 | 0.979 |
| 13.2699999999999 | 0.979 |
| 13.2799999999999 | 0.979 |
| 13.2899999999999 | 0.979 |
| 13.2999999999999 | 0.979 |
| 13.3099999999999 | 0.979 |
| 13.3199999999999 | 0.979 |
| 13.3299999999999 | 0.98 |
| 13.3399999999999 | 0.98 |
| 13.3499999999999 | 0.98 |
| 13.3599999999999 | 0.98 |
| 13.3699999999999 | 0.98 |
| 13.3799999999999 | 0.98 |
| 13.3899999999999 | 0.98 |
| 13.3999999999999 | 0.98 |
| 13.4099999999999 | 0.98 |
| 13.4199999999999 | 0.98 |
| 13.4299999999999 | 0.98 |
| 13.4399999999999 | 0.98 |
| 13.4499999999999 | 0.98 |
| 13.4599999999999 | 0.981 |
| 13.4699999999999 | 0.981 |
| 13.4799999999999 | 0.981 |
| 13.4899999999999 | 0.981 |
| 13.4999999999999 | 0.981 |
| 13.5099999999999 | 0.981 |
| 13.5199999999999 | 0.981 |
| 13.5299999999999 | 0.981 |
| 13.5399999999999 | 0.981 |
| 13.5499999999999 | 0.981 |
| 13.5599999999999 | 0.981 |
| 13.5699999999999 | 0.981 |
| 13.5799999999999 | 0.981 |
| 13.5899999999999 | 0.982 |
| 13.5999999999999 | 0.982 |
| 13.6099999999999 | 0.982 |
| 13.6199999999999 | 0.982 |
| 13.6299999999999 | 0.982 |
| 13.6399999999999 | 0.982 |
| 13.6499999999999 | 0.982 |
| 13.6599999999999 | 0.982 |
| 13.6699999999999 | 0.982 |
| 13.6799999999999 | 0.982 |
| 13.6899999999999 | 0.982 |
| 13.6999999999999 | 0.982 |
| 13.7099999999999 | 0.982 |
| 13.7199999999999 | 0.983 |
| 13.7299999999999 | 0.983 |
| 13.7399999999999 | 0.983 |
| 13.7499999999999 | 0.983 |
| 13.7599999999999 | 0.983 |
| 13.7699999999999 | 0.983 |
| 13.7799999999999 | 0.983 |
| 13.7899999999999 | 0.983 |
| 13.7999999999999 | 0.983 |
| 13.8099999999999 | 0.983 |
| 13.8199999999999 | 0.983 |
| 13.8299999999999 | 0.983 |
| 13.8399999999999 | 0.983 |
| 13.8499999999999 | 0.983 |
| 13.8599999999999 | 0.983 |
| 13.8699999999999 | 0.984 |
| 13.8799999999999 | 0.984 |
| 13.8899999999999 | 0.984 |
| 13.8999999999999 | 0.984 |
| 13.9099999999999 | 0.984 |
| 13.9199999999999 | 0.984 |
| 13.9299999999999 | 0.984 |
| 13.9399999999999 | 0.984 |
| 13.9499999999999 | 0.984 |
| 13.9599999999999 | 0.984 |
| 13.9699999999999 | 0.984 |
| 13.9799999999999 | 0.984 |
| 13.9899999999999 | 0.984 |
| 13.9999999999999 | 0.984 |
| 14.0099999999999 | 0.984 |
| 14.0199999999999 | 0.985 |
| 14.0299999999999 | 0.985 |
| 14.0399999999999 | 0.985 |
| 14.0499999999999 | 0.985 |
| 14.0599999999999 | 0.985 |
| 14.0699999999999 | 0.985 |
| 14.0799999999999 | 0.985 |
| 14.0899999999999 | 0.985 |
| 14.0999999999999 | 0.985 |
| 14.1099999999999 | 0.985 |
| 14.1199999999999 | 0.985 |
| 14.1299999999999 | 0.985 |
| 14.1399999999999 | 0.985 |
| 14.1499999999999 | 0.985 |
| 14.1599999999999 | 0.985 |
| 14.1699999999999 | 0.985 |
| 14.1799999999999 | 0.985 |
| 14.1899999999999 | 0.986 |
| 14.1999999999999 | 0.986 |
| 14.2099999999999 | 0.986 |
| 14.2199999999999 | 0.986 |
| 14.2299999999999 | 0.986 |
| 14.2399999999999 | 0.986 |
| 14.2499999999999 | 0.986 |
| 14.2599999999999 | 0.986 |
| 14.2699999999999 | 0.986 |
| 14.2799999999999 | 0.986 |
| 14.2899999999999 | 0.986 |
| 14.2999999999999 | 0.986 |
| 14.3099999999999 | 0.986 |
| 14.3199999999999 | 0.986 |
| 14.3299999999999 | 0.986 |
| 14.3399999999999 | 0.986 |
| 14.3499999999999 | 0.986 |
| 14.3599999999999 | 0.987 |
| 14.3699999999999 | 0.987 |
| 14.3799999999999 | 0.987 |
| 14.3899999999999 | 0.987 |
| 14.3999999999999 | 0.987 |
| 14.4099999999999 | 0.987 |
| 14.4199999999999 | 0.987 |
| 14.4299999999999 | 0.987 |
| 14.4399999999999 | 0.987 |
| 14.4499999999999 | 0.987 |
| 14.4599999999999 | 0.987 |
| 14.4699999999999 | 0.987 |
| 14.4799999999999 | 0.987 |
| 14.4899999999999 | 0.987 |
| 14.4999999999999 | 0.987 |
| 14.5099999999999 | 0.987 |
| 14.5199999999999 | 0.987 |
| 14.5299999999999 | 0.987 |
| 14.5399999999999 | 0.987 |
| 14.5499999999999 | 0.988 |
| 14.5599999999999 | 0.988 |
| 14.5699999999999 | 0.988 |
| 14.5799999999999 | 0.988 |
| 14.5899999999999 | 0.988 |
| 14.5999999999999 | 0.988 |
| 14.6099999999999 | 0.988 |
| 14.6199999999999 | 0.988 |
| 14.6299999999999 | 0.988 |
| 14.6399999999999 | 0.988 |
| 14.6499999999999 | 0.988 |
| 14.6599999999999 | 0.988 |
| 14.6699999999999 | 0.988 |
| 14.6799999999999 | 0.988 |
| 14.6899999999999 | 0.988 |
| 14.6999999999999 | 0.988 |
| 14.7099999999999 | 0.988 |
| 14.7199999999999 | 0.988 |
| 14.7299999999999 | 0.988 |
| 14.7399999999999 | 0.988 |
| 14.7499999999999 | 0.989 |
| 14.7599999999999 | 0.989 |
| 14.7699999999999 | 0.989 |
| 14.7799999999999 | 0.989 |
| 14.7899999999999 | 0.989 |
| 14.7999999999999 | 0.989 |
| 14.8099999999999 | 0.989 |
| 14.8199999999999 | 0.989 |
| 14.8299999999999 | 0.989 |
| 14.8399999999999 | 0.989 |
| 14.8499999999999 | 0.989 |
| 14.8599999999999 | 0.989 |
| 14.8699999999999 | 0.989 |
| 14.8799999999999 | 0.989 |
| 14.8899999999999 | 0.989 |
| 14.8999999999999 | 0.989 |
| 14.9099999999999 | 0.989 |
| 14.9199999999999 | 0.989 |
| 14.9299999999999 | 0.989 |
| 14.9399999999999 | 0.989 |
| 14.9499999999999 | 0.989 |
| 14.9599999999999 | 0.989 |
| 14.9699999999999 | 0.99 |
| 14.9799999999999 | 0.99 |
| 14.9899999999999 | 0.99 |
| 14.9999999999999 | 0.99 |
| 15.0099999999999 | 0.99 |
| 15.0199999999999 | 0.99 |
| 15.0299999999999 | 0.99 |
| 15.0399999999999 | 0.99 |
| 15.0499999999999 | 0.99 |
| 15.0599999999999 | 0.99 |
| 15.0699999999999 | 0.99 |
| 15.0799999999999 | 0.99 |
| 15.0899999999999 | 0.99 |
| 15.0999999999999 | 0.99 |
| 15.1099999999999 | 0.99 |
| 15.1199999999999 | 0.99 |
| 15.1299999999999 | 0.99 |
| 15.1399999999999 | 0.99 |
| 15.1499999999999 | 0.99 |
| 15.1599999999999 | 0.99 |
| 15.1699999999999 | 0.99 |
| 15.1799999999999 | 0.99 |
| 15.1899999999999 | 0.99 |
| 15.1999999999999 | 0.99 |
| 15.2099999999999 | 0.99 |
| 15.2199999999999 | 0.991 |
| 15.2299999999999 | 0.991 |
| 15.2399999999999 | 0.991 |
| 15.2499999999999 | 0.991 |
| 15.2599999999999 | 0.991 |
| 15.2699999999999 | 0.991 |
| 15.2799999999999 | 0.991 |
| 15.2899999999999 | 0.991 |
| 15.2999999999999 | 0.991 |
| 15.3099999999999 | 0.991 |
| 15.3199999999999 | 0.991 |
| 15.3299999999999 | 0.991 |
| 15.3399999999999 | 0.991 |
| 15.3499999999999 | 0.991 |
| 15.3599999999999 | 0.991 |
| 15.3699999999999 | 0.991 |
| 15.3799999999999 | 0.991 |
| 15.3899999999999 | 0.991 |
| 15.3999999999999 | 0.991 |
| 15.4099999999999 | 0.991 |
| 15.4199999999999 | 0.991 |
| 15.4299999999999 | 0.991 |
| 15.4399999999999 | 0.991 |
| 15.4499999999999 | 0.991 |
| 15.4599999999999 | 0.991 |
| 15.4699999999999 | 0.991 |
| 15.4799999999999 | 0.992 |
| 15.4899999999999 | 0.992 |
| 15.4999999999999 | 0.992 |
| 15.5099999999999 | 0.992 |
| 15.5199999999999 | 0.992 |
| 15.5299999999999 | 0.992 |
| 15.5399999999999 | 0.992 |
| 15.5499999999999 | 0.992 |
| 15.5599999999999 | 0.992 |
| 15.5699999999999 | 0.992 |
| 15.5799999999999 | 0.992 |
| 15.5899999999999 | 0.992 |
| 15.5999999999999 | 0.992 |
| 15.6099999999999 | 0.992 |
| 15.6199999999999 | 0.992 |
| 15.6299999999999 | 0.992 |
| 15.6399999999999 | 0.992 |
| 15.6499999999999 | 0.992 |
| 15.6599999999999 | 0.992 |
| 15.6699999999999 | 0.992 |
| 15.6799999999999 | 0.992 |
| 15.6899999999999 | 0.992 |
| 15.6999999999999 | 0.992 |
| 15.7099999999999 | 0.992 |
| 15.7199999999999 | 0.992 |
| 15.7299999999999 | 0.992 |
| 15.7399999999999 | 0.992 |
| 15.7499999999999 | 0.992 |
| 15.7599999999999 | 0.992 |
| 15.7699999999999 | 0.992 |
| 15.7799999999999 | 0.992 |
| 15.7899999999999 | 0.993 |
| 15.7999999999999 | 0.993 |
| 15.8099999999999 | 0.993 |
| 15.8199999999999 | 0.993 |
| 15.8299999999999 | 0.993 |
| 15.8399999999999 | 0.993 |
| 15.8499999999999 | 0.993 |
| 15.8599999999999 | 0.993 |
| 15.8699999999999 | 0.993 |
| 15.8799999999999 | 0.993 |
| 15.8899999999999 | 0.993 |
| 15.8999999999999 | 0.993 |
| 15.9099999999999 | 0.993 |
| 15.9199999999999 | 0.993 |
| 15.9299999999999 | 0.993 |
| 15.9399999999999 | 0.993 |
| 15.9499999999999 | 0.993 |
| 15.9599999999999 | 0.993 |
| 15.9699999999999 | 0.993 |
| 15.9799999999999 | 0.993 |
| 15.9899999999999 | 0.993 |
| 15.9999999999999 | 0.993 |
| 16.0099999999999 | 0.993 |
| 16.0199999999999 | 0.993 |
| 16.0299999999999 | 0.993 |
| 16.0399999999999 | 0.993 |
| 16.0499999999999 | 0.993 |
| 16.0599999999999 | 0.993 |
| 16.0699999999999 | 0.993 |
| 16.0799999999999 | 0.993 |
| 16.0899999999999 | 0.993 |
| 16.0999999999999 | 0.993 |
| 16.1099999999999 | 0.993 |
| 16.1199999999999 | 0.993 |
| 16.1299999999999 | 0.994 |
| 16.1399999999999 | 0.994 |
| 16.1499999999999 | 0.994 |
| 16.1599999999999 | 0.994 |
| 16.1699999999999 | 0.994 |
| 16.1799999999999 | 0.994 |
| 16.1899999999999 | 0.994 |
| 16.1999999999999 | 0.994 |
| 16.2099999999999 | 0.994 |
| 16.2199999999999 | 0.994 |
| 16.2299999999999 | 0.994 |
| 16.2399999999999 | 0.994 |
| 16.2499999999999 | 0.994 |
| 16.2599999999999 | 0.994 |
| 16.2699999999999 | 0.994 |
| 16.2799999999999 | 0.994 |
| 16.2899999999999 | 0.994 |
| 16.2999999999999 | 0.994 |
| 16.3099999999999 | 0.994 |
| 16.3199999999999 | 0.994 |
| 16.3299999999999 | 0.994 |
| 16.3399999999999 | 0.994 |
| 16.3499999999999 | 0.994 |
| 16.3599999999999 | 0.994 |
| 16.3699999999999 | 0.994 |
| 16.3799999999999 | 0.994 |
| 16.3899999999999 | 0.994 |
| 16.3999999999999 | 0.994 |
| 16.4099999999999 | 0.994 |
| 16.4199999999999 | 0.994 |
| 16.4299999999999 | 0.994 |
| 16.4399999999999 | 0.994 |
| 16.4499999999999 | 0.994 |
| 16.4599999999999 | 0.994 |
| 16.4699999999999 | 0.994 |
| 16.4799999999999 | 0.994 |
| 16.4899999999999 | 0.994 |
| 16.4999999999999 | 0.994 |
| 16.5099999999999 | 0.994 |
| 16.5199999999999 | 0.994 |
| 16.5299999999999 | 0.995 |
| 16.5399999999999 | 0.995 |
| 16.5499999999999 | 0.995 |
| 16.5599999999999 | 0.995 |
| 16.5699999999999 | 0.995 |
| 16.5799999999999 | 0.995 |
| 16.5899999999999 | 0.995 |
| 16.5999999999999 | 0.995 |
| 16.6099999999999 | 0.995 |
| 16.6199999999999 | 0.995 |
| 16.6299999999999 | 0.995 |
| 16.6399999999999 | 0.995 |
| 16.6499999999999 | 0.995 |
| 16.6599999999999 | 0.995 |
| 16.6699999999999 | 0.995 |
| 16.6799999999999 | 0.995 |
| 16.6899999999999 | 0.995 |
| 16.6999999999999 | 0.995 |
| 16.7099999999999 | 0.995 |
| 16.7199999999999 | 0.995 |
| 16.7299999999999 | 0.995 |
| 16.7399999999999 | 0.995 |
| 16.7499999999999 | 0.995 |
| 16.7599999999999 | 0.995 |
| 16.7699999999999 | 0.995 |
| 16.7799999999999 | 0.995 |
| 16.7899999999998 | 0.995 |
| 16.7999999999999 | 0.995 |
| 16.8099999999998 | 0.995 |
| 16.8199999999999 | 0.995 |
| 16.8299999999998 | 0.995 |
| 16.8399999999999 | 0.995 |
| 16.8499999999999 | 0.995 |
| 16.8599999999999 | 0.995 |
| 16.8699999999998 | 0.995 |
| 16.8799999999998 | 0.995 |
| 16.8899999999999 | 0.995 |
| 16.8999999999998 | 0.995 |
| 16.9099999999999 | 0.995 |
| 16.9199999999999 | 0.995 |
| 16.9299999999999 | 0.995 |
| 16.9399999999998 | 0.995 |
| 16.9499999999999 | 0.995 |
| 16.9599999999999 | 0.995 |
| 16.9699999999998 | 0.995 |
| 16.9799999999999 | 0.995 |
| 16.9899999999998 | 0.995 |
| 16.9999999999999 | 0.996 |
| 17.0099999999998 | 0.996 |
| 17.0199999999999 | 0.996 |
| 17.0299999999999 | 0.996 |
| 17.0399999999998 | 0.996 |
| 17.0499999999999 | 0.996 |
| 17.0599999999998 | 0.996 |
| 17.0699999999999 | 0.996 |
| 17.0799999999998 | 0.996 |
| 17.0899999999999 | 0.996 |
| 17.0999999999999 | 0.996 |
| 17.1099999999999 | 0.996 |
| 17.1199999999998 | 0.996 |
| 17.1299999999998 | 0.996 |
| 17.1399999999999 | 0.996 |
| 17.1499999999998 | 0.996 |
| 17.1599999999999 | 0.996 |
| 17.1699999999999 | 0.996 |
| 17.1799999999999 | 0.996 |
| 17.1899999999998 | 0.996 |
| 17.1999999999999 | 0.996 |
| 17.2099999999999 | 0.996 |
| 17.2199999999998 | 0.996 |
| 17.2299999999999 | 0.996 |
| 17.2399999999998 | 0.996 |
| 17.2499999999999 | 0.996 |
| 17.2599999999998 | 0.996 |
| 17.2699999999998 | 0.996 |
| 17.2799999999998 | 0.996 |
| 17.2899999999998 | 0.996 |
| 17.2999999999998 | 0.996 |
| 17.3099999999998 | 0.996 |
| 17.3199999999998 | 0.996 |
| 17.3299999999998 | 0.996 |
| 17.3399999999998 | 0.996 |
| 17.3499999999998 | 0.996 |
| 17.3599999999998 | 0.996 |
| 17.3699999999998 | 0.996 |
| 17.3799999999998 | 0.996 |
| 17.3899999999998 | 0.996 |
| 17.3999999999998 | 0.996 |
| 17.4099999999998 | 0.996 |
| 17.4199999999998 | 0.996 |
| 17.4299999999998 | 0.996 |
| 17.4399999999998 | 0.996 |
| 17.4499999999998 | 0.996 |
| 17.4599999999998 | 0.996 |
| 17.4699999999998 | 0.996 |
| 17.4799999999998 | 0.996 |
| 17.4899999999998 | 0.996 |
| 17.4999999999998 | 0.996 |
| 17.5099999999998 | 0.996 |
| 17.5199999999998 | 0.996 |
| 17.5299999999998 | 0.996 |
| 17.5399999999998 | 0.996 |
| 17.5499999999998 | 0.996 |
| 17.5599999999998 | 0.996 |
| 17.5699999999998 | 0.996 |
| 17.5799999999998 | 0.996 |
| 17.5899999999998 | 0.996 |
| 17.5999999999998 | 0.997 |
| 17.6099999999998 | 0.997 |
| 17.6199999999998 | 0.997 |
| 17.6299999999998 | 0.997 |
| 17.6399999999998 | 0.997 |
| 17.6499999999998 | 0.997 |
| 17.6599999999998 | 0.997 |
| 17.6699999999998 | 0.997 |
| 17.6799999999998 | 0.997 |
| 17.6899999999998 | 0.997 |
| 17.6999999999998 | 0.997 |
| 17.7099999999998 | 0.997 |
| 17.7199999999998 | 0.997 |
| 17.7299999999998 | 0.997 |
| 17.7399999999998 | 0.997 |
| 17.7499999999998 | 0.997 |
| 17.7599999999998 | 0.997 |
| 17.7699999999998 | 0.997 |
| 17.7799999999998 | 0.997 |
| 17.7899999999998 | 0.997 |
| 17.7999999999998 | 0.997 |
| 17.8099999999998 | 0.997 |
| 17.8199999999998 | 0.997 |
| 17.8299999999998 | 0.997 |
| 17.8399999999998 | 0.997 |
| 17.8499999999998 | 0.997 |
| 17.8599999999998 | 0.997 |
| 17.8699999999998 | 0.997 |
| 17.8799999999998 | 0.997 |
| 17.8899999999998 | 0.997 |
| 17.8999999999998 | 0.997 |
| 17.9099999999998 | 0.997 |
| 17.9199999999998 | 0.997 |
| 17.9299999999998 | 0.997 |
| 17.9399999999998 | 0.997 |
| 17.9499999999998 | 0.997 |
| 17.9599999999998 | 0.997 |
| 17.9699999999998 | 0.997 |
| 17.9799999999998 | 0.997 |
| 17.9899999999998 | 0.997 |
| 17.9999999999998 | 0.997 |
| 18.0099999999998 | 0.997 |
| 18.0199999999998 | 0.997 |
| 18.0299999999998 | 0.997 |
| 18.0399999999998 | 0.997 |
| 18.0499999999998 | 0.997 |
| 18.0599999999998 | 0.997 |
| 18.0699999999998 | 0.997 |
| 18.0799999999998 | 0.997 |
| 18.0899999999998 | 0.997 |
| 18.0999999999998 | 0.997 |
| 18.1099999999998 | 0.997 |
| 18.1199999999998 | 0.997 |
| 18.1299999999998 | 0.997 |
| 18.1399999999998 | 0.997 |
| 18.1499999999998 | 0.997 |
| 18.1599999999998 | 0.997 |
| 18.1699999999998 | 0.997 |
| 18.1799999999998 | 0.997 |
| 18.1899999999998 | 0.997 |
| 18.1999999999998 | 0.997 |
| 18.2099999999998 | 0.997 |
| 18.2199999999998 | 0.997 |
| 18.2299999999998 | 0.997 |
| 18.2399999999998 | 0.997 |
| 18.2499999999998 | 0.997 |
| 18.2599999999998 | 0.997 |
| 18.2699999999998 | 0.997 |
| 18.2799999999998 | 0.997 |
| 18.2899999999998 | 0.997 |
| 18.2999999999998 | 0.997 |
| 18.3099999999998 | 0.997 |
| 18.3199999999998 | 0.997 |
| 18.3299999999998 | 0.997 |
| 18.3399999999998 | 0.997 |
| 18.3499999999998 | 0.997 |
| 18.3599999999998 | 0.997 |
| 18.3699999999998 | 0.997 |
| 18.3799999999998 | 0.997 |
| 18.3899999999998 | 0.998 |
| 18.3999999999998 | 0.998 |
| 18.4099999999998 | 0.998 |
| 18.4199999999998 | 0.998 |
| 18.4299999999998 | 0.998 |
| 18.4399999999998 | 0.998 |
| 18.4499999999998 | 0.998 |
| 18.4599999999998 | 0.998 |
| 18.4699999999998 | 0.998 |
| 18.4799999999998 | 0.998 |
| 18.4899999999998 | 0.998 |
| 18.4999999999998 | 0.998 |
| 18.5099999999998 | 0.998 |
| 18.5199999999998 | 0.998 |
| 18.5299999999998 | 0.998 |
| 18.5399999999998 | 0.998 |
| 18.5499999999998 | 0.998 |
| 18.5599999999998 | 0.998 |
| 18.5699999999998 | 0.998 |
| 18.5799999999998 | 0.998 |
| 18.5899999999998 | 0.998 |
| 18.5999999999998 | 0.998 |
| 18.6099999999998 | 0.998 |
| 18.6199999999998 | 0.998 |
| 18.6299999999998 | 0.998 |
| 18.6399999999998 | 0.998 |
| 18.6499999999998 | 0.998 |
| 18.6599999999998 | 0.998 |
| 18.6699999999998 | 0.998 |
| 18.6799999999998 | 0.998 |
| 18.6899999999998 | 0.998 |
| 18.6999999999998 | 0.998 |
| 18.7099999999998 | 0.998 |
| 18.7199999999998 | 0.998 |
| 18.7299999999998 | 0.998 |
| 18.7399999999998 | 0.998 |
| 18.7499999999998 | 0.998 |
| 18.7599999999998 | 0.998 |
| 18.7699999999998 | 0.998 |
| 18.7799999999998 | 0.998 |
| 18.7899999999998 | 0.998 |
| 18.7999999999998 | 0.998 |
| 18.8099999999998 | 0.998 |
| 18.8199999999998 | 0.998 |
| 18.8299999999998 | 0.998 |
| 18.8399999999998 | 0.998 |
| 18.8499999999998 | 0.998 |
| 18.8599999999998 | 0.998 |
| 18.8699999999998 | 0.998 |
| 18.8799999999998 | 0.998 |
| 18.8899999999998 | 0.998 |
| 18.8999999999998 | 0.998 |
| 18.9099999999998 | 0.998 |
| 18.9199999999998 | 0.998 |
| 18.9299999999998 | 0.998 |
| 18.9399999999998 | 0.998 |
| 18.9499999999998 | 0.998 |
| 18.9599999999998 | 0.998 |
| 18.9699999999998 | 0.998 |
| 18.9799999999998 | 0.998 |
| 18.9899999999998 | 0.998 |
| 18.9999999999998 | 0.998 |
| 19.0099999999998 | 0.998 |
| 19.0199999999998 | 0.998 |
| 19.0299999999998 | 0.998 |
| 19.0399999999998 | 0.998 |
| 19.0499999999998 | 0.998 |
| 19.0599999999998 | 0.998 |
| 19.0699999999998 | 0.998 |
| 19.0799999999998 | 0.998 |
| 19.0899999999998 | 0.998 |
| 19.0999999999998 | 0.998 |
| 19.1099999999998 | 0.998 |
| 19.1199999999998 | 0.998 |
| 19.1299999999998 | 0.998 |
| 19.1399999999998 | 0.998 |
| 19.1499999999998 | 0.998 |
| 19.1599999999998 | 0.998 |
| 19.1699999999998 | 0.998 |
| 19.1799999999998 | 0.998 |
| 19.1899999999998 | 0.998 |
| 19.1999999999998 | 0.998 |
| 19.2099999999998 | 0.998 |
| 19.2199999999998 | 0.998 |
| 19.2299999999998 | 0.998 |
| 19.2399999999998 | 0.998 |
| 19.2499999999998 | 0.998 |
| 19.2599999999998 | 0.998 |
| 19.2699999999998 | 0.998 |
| 19.2799999999998 | 0.998 |
| 19.2899999999998 | 0.998 |
| 19.2999999999998 | 0.998 |
| 19.3099999999998 | 0.998 |
| 19.3199999999998 | 0.998 |
| 19.3299999999998 | 0.998 |
| 19.3399999999998 | 0.998 |
| 19.3499999999998 | 0.998 |
| 19.3599999999998 | 0.998 |
| 19.3699999999998 | 0.998 |
| 19.3799999999998 | 0.998 |
| 19.3899999999998 | 0.998 |
| 19.3999999999998 | 0.998 |
| 19.4099999999998 | 0.998 |
| 19.4199999999998 | 0.998 |
| 19.4299999999998 | 0.998 |
| 19.4399999999998 | 0.998 |
| 19.4499999999998 | 0.998 |
| 19.4599999999998 | 0.998 |
| 19.4699999999998 | 0.998 |
| 19.4799999999998 | 0.998 |
| 19.4899999999998 | 0.998 |
| 19.4999999999998 | 0.998 |
| 19.5099999999998 | 0.998 |
| 19.5199999999998 | 0.998 |
| 19.5299999999998 | 0.998 |
| 19.5399999999998 | 0.998 |
| 19.5499999999998 | 0.998 |
| 19.5599999999998 | 0.998 |
| 19.5699999999998 | 0.998 |
| 19.5799999999998 | 0.999 |
| 19.5899999999998 | 0.999 |
| 19.5999999999998 | 0.999 |
| 19.6099999999998 | 0.999 |
| 19.6199999999998 | 0.999 |
| 19.6299999999998 | 0.999 |
| 19.6399999999998 | 0.999 |
| 19.6499999999998 | 0.999 |
| 19.6599999999998 | 0.999 |
| 19.6699999999998 | 0.999 |
| 19.6799999999998 | 0.999 |
| 19.6899999999998 | 0.999 |
| 19.6999999999998 | 0.999 |
| 19.7099999999998 | 0.999 |
| 19.7199999999998 | 0.999 |
| 19.7299999999998 | 0.999 |
| 19.7399999999998 | 0.999 |
| 19.7499999999998 | 0.999 |
| 19.7599999999998 | 0.999 |
| 19.7699999999998 | 0.999 |
| 19.7799999999998 | 0.999 |
| 19.7899999999998 | 0.999 |
| 19.7999999999998 | 0.999 |
| 19.8099999999998 | 0.999 |
| 19.8199999999998 | 0.999 |
| 19.8299999999998 | 0.999 |
| 19.8399999999998 | 0.999 |
| 19.8499999999998 | 0.999 |
| 19.8599999999998 | 0.999 |
| 19.8699999999998 | 0.999 |
| 19.8799999999998 | 0.999 |
| 19.8899999999998 | 0.999 |
| 19.8999999999998 | 0.999 |
| 19.9099999999998 | 0.999 |
| 19.9199999999998 | 0.999 |
| 19.9299999999998 | 0.999 |
| 19.9399999999998 | 0.999 |
| 19.9499999999998 | 0.999 |
| 19.9599999999998 | 0.999 |
| 19.9699999999998 | 0.999 |
| 19.9799999999998 | 0.999 |
| 19.9899999999998 | 0.999 |
| 19.9999999999998 | 0.999 |